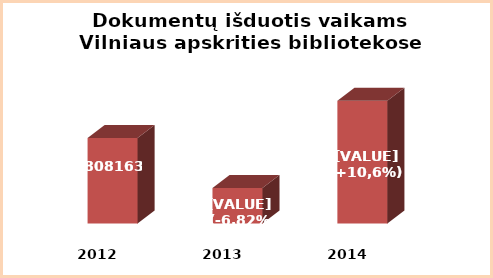
| Category | Series 0 |
|---|---|
| 2012.0 | 808163 |
| 2013.0 | 756560 |
| 2014.0 | 846757 |